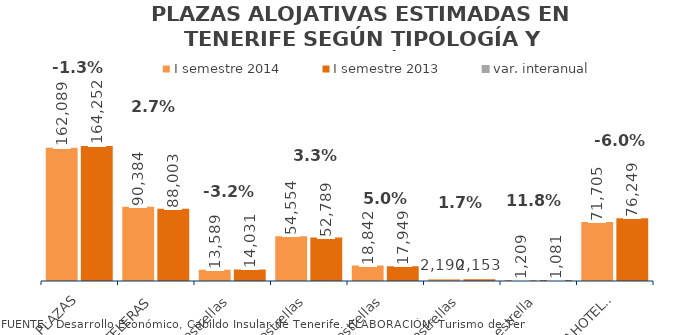
| Category | I semestre 2014 | I semestre 2013 |
|---|---|---|
| TOTAL PLAZAS | 162089 | 164252 |
| HOTELERAS | 90384 | 88003 |
| 5 estrellas | 13589 | 14031 |
| 4 estrellas | 54554 | 52789 |
| 3 estrellas | 18842 | 17949 |
| 2 estrellas | 2190 | 2153 |
| 1 estrella | 1209 | 1081 |
| EXTRAHOTELERAS | 71705 | 76249 |